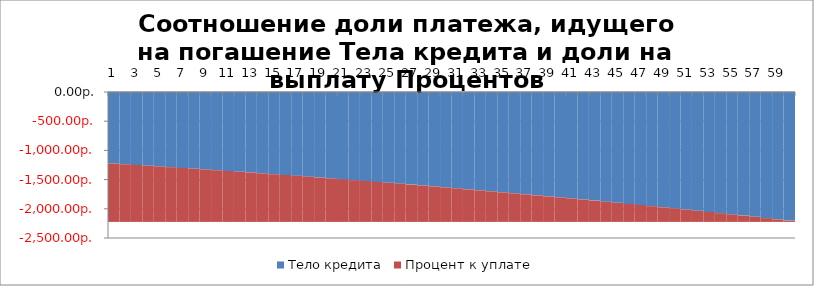
| Category | Тело кредита | Процент к уплате |
|---|---|---|
| 0 | -1224.445 | -1000 |
| 1 | -1236.689 | -987.756 |
| 2 | -1249.056 | -975.389 |
| 3 | -1261.547 | -962.898 |
| 4 | -1274.162 | -950.283 |
| 5 | -1286.904 | -937.541 |
| 6 | -1299.773 | -924.672 |
| 7 | -1312.771 | -911.674 |
| 8 | -1325.898 | -898.547 |
| 9 | -1339.157 | -885.288 |
| 10 | -1352.549 | -871.896 |
| 11 | -1366.074 | -858.37 |
| 12 | -1379.735 | -844.71 |
| 13 | -1393.532 | -830.912 |
| 14 | -1407.468 | -816.977 |
| 15 | -1421.542 | -802.902 |
| 16 | -1435.758 | -788.687 |
| 17 | -1450.115 | -774.329 |
| 18 | -1464.617 | -759.828 |
| 19 | -1479.263 | -745.182 |
| 20 | -1494.055 | -730.389 |
| 21 | -1508.996 | -715.449 |
| 22 | -1524.086 | -700.359 |
| 23 | -1539.327 | -685.118 |
| 24 | -1554.72 | -669.725 |
| 25 | -1570.267 | -654.178 |
| 26 | -1585.97 | -638.475 |
| 27 | -1601.83 | -622.615 |
| 28 | -1617.848 | -606.597 |
| 29 | -1634.026 | -590.418 |
| 30 | -1650.367 | -574.078 |
| 31 | -1666.87 | -557.575 |
| 32 | -1683.539 | -540.906 |
| 33 | -1700.374 | -524.07 |
| 34 | -1717.378 | -507.067 |
| 35 | -1734.552 | -489.893 |
| 36 | -1751.897 | -472.547 |
| 37 | -1769.416 | -455.028 |
| 38 | -1787.11 | -437.334 |
| 39 | -1804.982 | -419.463 |
| 40 | -1823.031 | -401.413 |
| 41 | -1841.262 | -383.183 |
| 42 | -1859.674 | -364.77 |
| 43 | -1878.271 | -346.174 |
| 44 | -1897.054 | -327.391 |
| 45 | -1916.024 | -308.42 |
| 46 | -1935.185 | -289.26 |
| 47 | -1954.536 | -269.908 |
| 48 | -1974.082 | -250.363 |
| 49 | -1993.823 | -230.622 |
| 50 | -2013.761 | -210.684 |
| 51 | -2033.898 | -190.546 |
| 52 | -2054.237 | -170.207 |
| 53 | -2074.78 | -149.665 |
| 54 | -2095.528 | -128.917 |
| 55 | -2116.483 | -107.962 |
| 56 | -2137.648 | -86.797 |
| 57 | -2159.024 | -65.421 |
| 58 | -2180.614 | -43.83 |
| 59 | -2202.421 | -22.024 |